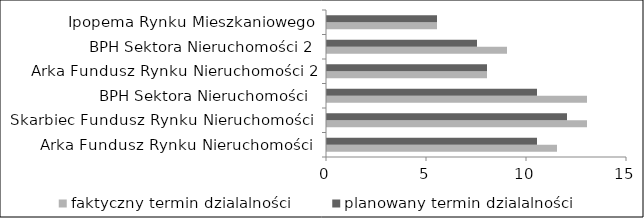
| Category | faktyczny termin dzialalności | planowany termin dzialalności |
|---|---|---|
| Arka Fundusz Rynku Nieruchomości  | 11.5 | 10.5 |
| Skarbiec Fundusz Rynku Nieruchomości  | 13 | 12 |
| BPH Sektora Nieruchomości  | 13 | 10.5 |
| Arka Fundusz Rynku Nieruchomości 2 | 8 | 8 |
| BPH Sektora Nieruchomości 2 | 9 | 7.5 |
| Ipopema Rynku Mieszkaniowego | 5.5 | 5.5 |